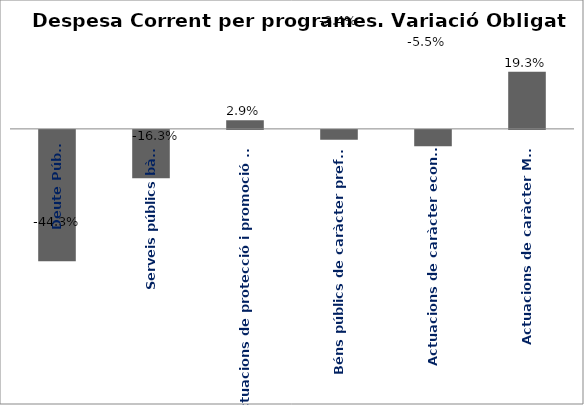
| Category | Series 0 |
|---|---|
| Deute Públic | -0.443 |
| Serveis públics bàsics | -0.163 |
| Actuacions de protecció i promoció social | 0.029 |
| Béns públics de caràcter preferent | -0.034 |
| Actuacions de caràcter econòmic | -0.055 |
| Actuacions de caràcter Marçal | 0.193 |